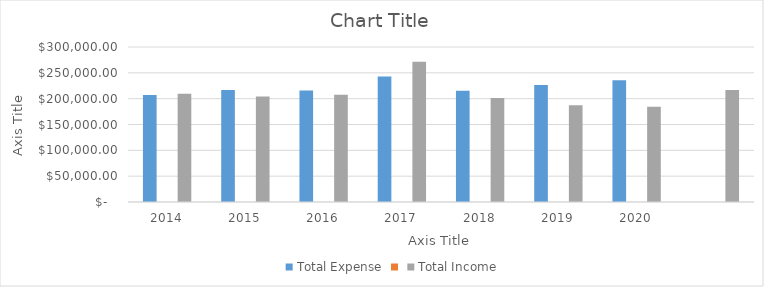
| Category | Total Expense | Series 1 | Total Income |
|---|---|---|---|
| 2014.0 | 206980 |  | 209465 |
| 2015.0 | 216854 |  | 204008 |
| 2016.0 | 215963 |  | 207710 |
| 2017.0 | 242918 |  | 271215 |
| 2018.0 | 215250 |  | 201526 |
| 2019.0 | 226518.5 |  | 187452.1 |
| 2020.0 | 235625.05 |  | 184417.31 |